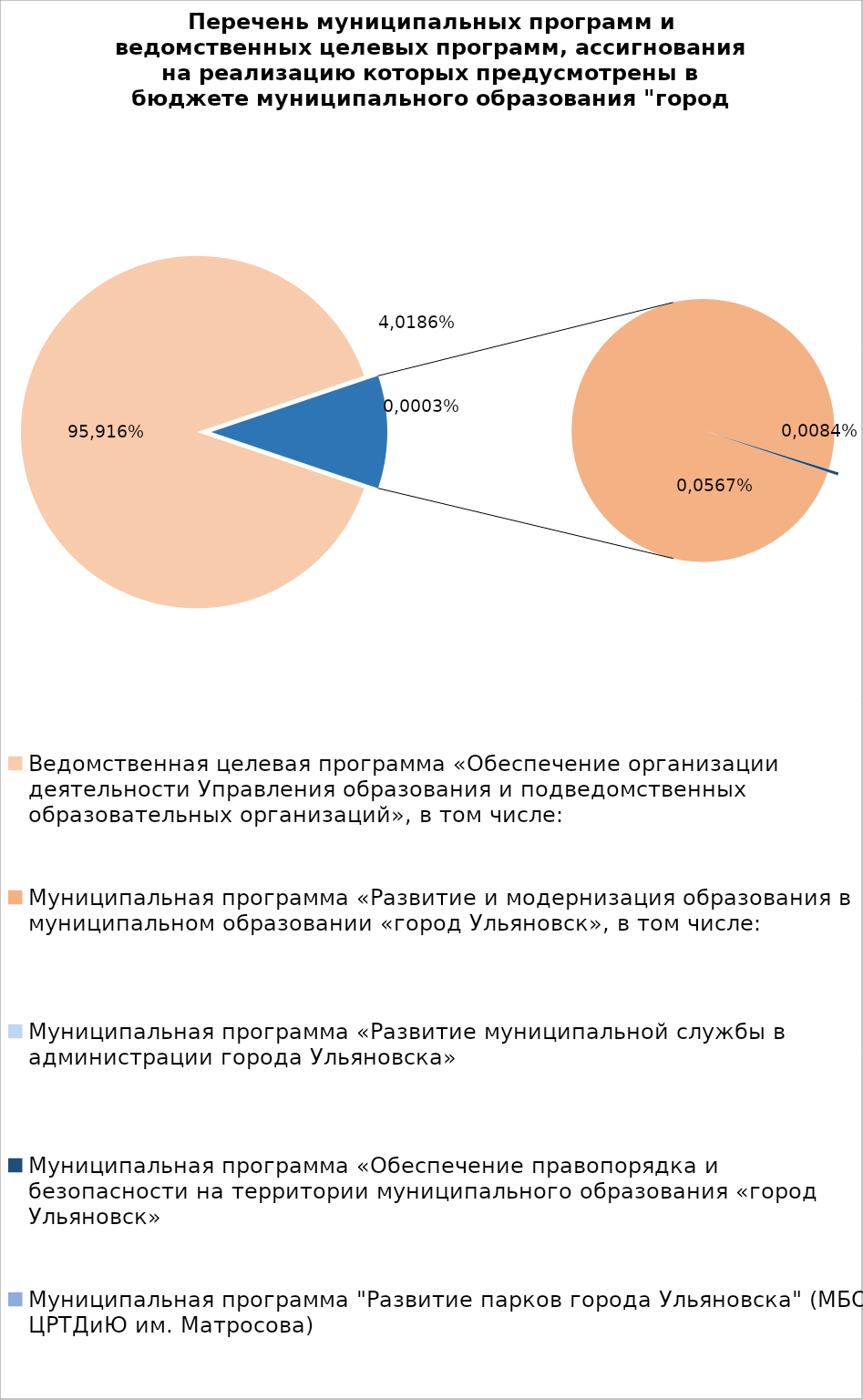
| Category | Series 0 |
|---|---|
| Ведомственная целевая программа «Обеспечение организации деятельности Управления образования и подведомственных образовательных организаций», в том числе: | 6959655.67 |
| Муниципальная программа «Развитие и модернизация образования в муниципальном образовании «город Ульяновск», в том числе: | 799644.04 |
| Муниципальная программа «Развитие муниципальной службы в администрации города Ульяновска» | 14.3 |
| Муниципальная программа «Обеспечение правопорядка и безопасности на территории муниципального образования «город Ульяновск» | 2700 |
| Муниципальная программа "Развитие парков города Ульяновска" (МБОУ ЦРТДиЮ им. Матросова) | 400 |